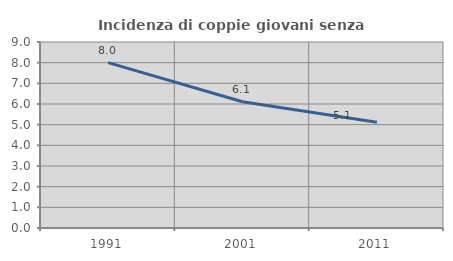
| Category | Incidenza di coppie giovani senza figli |
|---|---|
| 1991.0 | 8 |
| 2001.0 | 6.111 |
| 2011.0 | 5.122 |